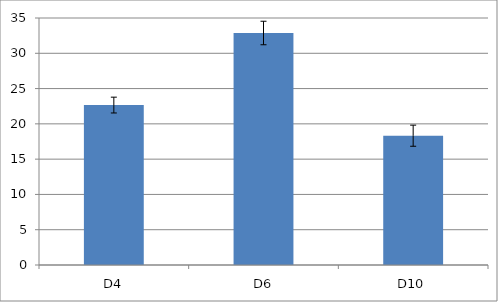
| Category | Series 0 |
|---|---|
| D4 | 22.662 |
| D6 | 32.874 |
| D10 | 18.321 |